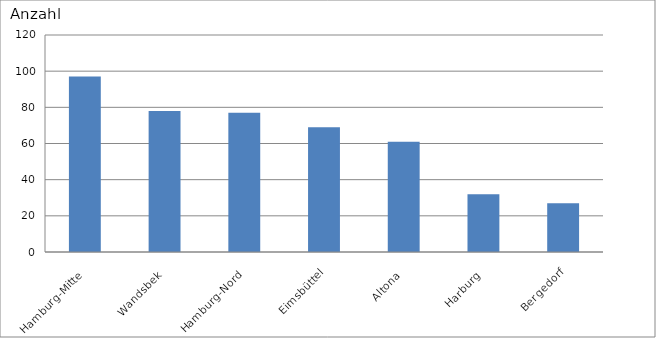
| Category | Hamburg-Mitte |
|---|---|
| Hamburg-Mitte | 97 |
| Wandsbek | 78 |
| Hamburg-Nord | 77 |
| Eimsbüttel | 69 |
| Altona | 61 |
| Harburg | 32 |
| Bergedorf | 27 |